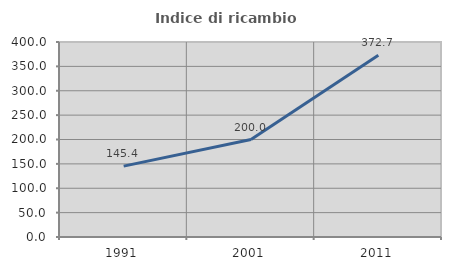
| Category | Indice di ricambio occupazionale  |
|---|---|
| 1991.0 | 145.385 |
| 2001.0 | 200 |
| 2011.0 | 372.727 |